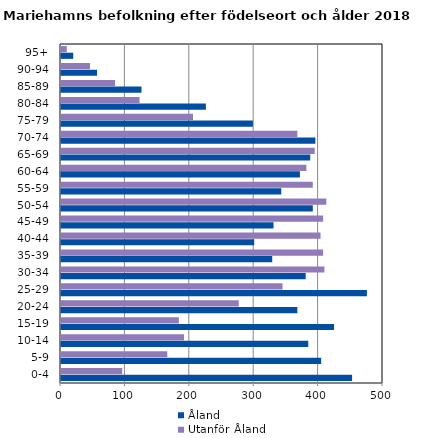
| Category | Åland | Utanför Åland |
|---|---|---|
| 0-4 | 452 | 95 |
| 5-9 | 404 | 165 |
| 10-14 | 384 | 191 |
| 15-19 | 424 | 183 |
| 20-24 | 367 | 276 |
| 25-29 | 475 | 344 |
| 30-34 | 380 | 409 |
| 35-39 | 328 | 407 |
| 40-44 | 300 | 403 |
| 45-49 | 330 | 407 |
| 50-54 | 391 | 412 |
| 55-59 | 342 | 391 |
| 60-64 | 371 | 381 |
| 65-69 | 387 | 394 |
| 70-74 | 395 | 367 |
| 75-79 | 298 | 205 |
| 80-84 | 225 | 122 |
| 85-89 | 125 | 84 |
| 90-94 | 56 | 45 |
| 95+ | 19 | 9 |